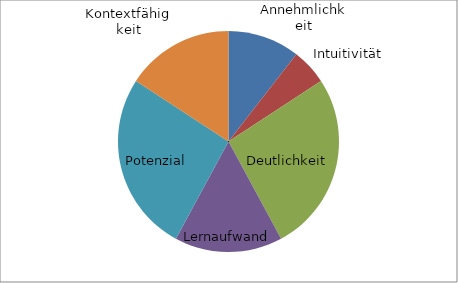
| Category | Series 0 |
|---|---|
| Annehmlichkeit | 10.526 |
| Intuitivität | 5.263 |
| Deutlichkeit | 26.316 |
| Lernaufwand | 15.789 |
| Potenzial | 26.316 |
| Kontextfähigkeit | 15.789 |